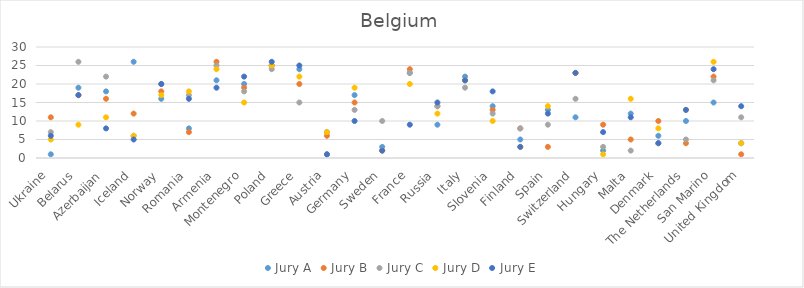
| Category | Jury A | Jury B | Jury C | Jury D | Jury E |
|---|---|---|---|---|---|
| Ukraine | 1 | 11 | 7 | 5 | 6 |
| Belarus | 19 | 17 | 26 | 9 | 17 |
| Azerbaijan | 18 | 16 | 22 | 11 | 8 |
| Iceland | 26 | 12 | 6 | 6 | 5 |
| Norway | 16 | 18 | 20 | 17 | 20 |
| Romania | 8 | 7 | 17 | 18 | 16 |
| Armenia | 21 | 26 | 25 | 24 | 19 |
| Montenegro | 20 | 19 | 18 | 15 | 22 |
| Poland | 25 | 25 | 24 | 25 | 26 |
| Greece | 24 | 20 | 15 | 22 | 25 |
| Austria | 7 | 6 | 1 | 7 | 1 |
| Germany | 17 | 15 | 13 | 19 | 10 |
| Sweden | 3 | 2 | 10 | 2 | 2 |
| France | 23 | 24 | 23 | 20 | 9 |
| Russia | 9 | 14 | 14 | 12 | 15 |
| Italy | 22 | 21 | 19 | 21 | 21 |
| Slovenia | 14 | 13 | 12 | 10 | 18 |
| Finland | 5 | 8 | 8 | 3 | 3 |
| Spain | 13 | 3 | 9 | 14 | 12 |
| Switzerland | 11 | 23 | 16 | 23 | 23 |
| Hungary | 2 | 9 | 3 | 1 | 7 |
| Malta | 12 | 5 | 2 | 16 | 11 |
| Denmark | 6 | 10 | 4 | 8 | 4 |
| The Netherlands | 10 | 4 | 5 | 13 | 13 |
| San Marino | 15 | 22 | 21 | 26 | 24 |
| United Kingdom | 4 | 1 | 11 | 4 | 14 |